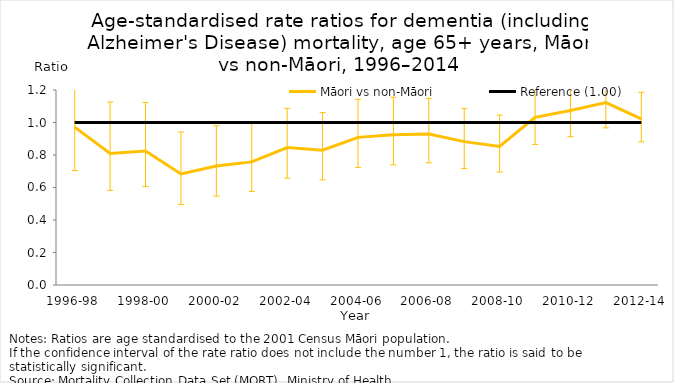
| Category | Māori vs non-Māori | Reference (1.00) |
|---|---|---|
| 1996-98 | 0.971 | 1 |
| 1997-99 | 0.81 | 1 |
| 1998-00 | 0.825 | 1 |
| 1999-01 | 0.683 | 1 |
| 2000-02 | 0.732 | 1 |
| 2001-03 | 0.758 | 1 |
| 2002-04 | 0.845 | 1 |
| 2003-05 | 0.829 | 1 |
| 2004-06 | 0.909 | 1 |
| 2005-07 | 0.924 | 1 |
| 2006-08 | 0.929 | 1 |
| 2007-09 | 0.882 | 1 |
| 2008-10 | 0.853 | 1 |
| 2009-11 | 1.032 | 1 |
| 2010-12 | 1.074 | 1 |
| 2011-13 | 1.122 | 1 |
| 2012-14 | 1.022 | 1 |